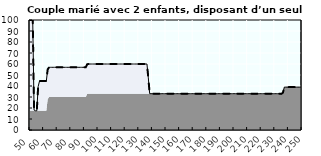
| Category | Coin fiscal marginal (somme des composantes) | Taux d’imposition marginal net |
|---|---|---|
| 50.0 | 100 | 100 |
| 51.0 | 100 | 100 |
| 52.0 | 100 | 100 |
| 53.0 | 18.1 | 18.1 |
| 54.0 | 17.5 | 17.5 |
| 55.0 | 17.5 | 17.5 |
| 56.0 | 39.546 | 39.546 |
| 57.0 | 44.5 | 44.5 |
| 58.0 | 44.5 | 44.5 |
| 59.0 | 44.5 | 44.5 |
| 60.0 | 44.5 | 44.5 |
| 61.0 | 44.5 | 44.5 |
| 62.0 | 44.5 | 44.5 |
| 63.0 | 55.037 | 55.037 |
| 64.0 | 57 | 57 |
| 65.0 | 57 | 57 |
| 66.0 | 57 | 57 |
| 67.0 | 57 | 57 |
| 68.0 | 57 | 57 |
| 69.0 | 57 | 57 |
| 70.0 | 57 | 57 |
| 71.0 | 57 | 57 |
| 72.0 | 57 | 57 |
| 73.0 | 57 | 57 |
| 74.0 | 57 | 57 |
| 75.0 | 57 | 57 |
| 76.0 | 57 | 57 |
| 77.0 | 57 | 57 |
| 78.0 | 57 | 57 |
| 79.0 | 57 | 57 |
| 80.0 | 57 | 57 |
| 81.0 | 57 | 57 |
| 82.0 | 57 | 57 |
| 83.0 | 57 | 57 |
| 84.0 | 57 | 57 |
| 85.0 | 57 | 57 |
| 86.0 | 57 | 57 |
| 87.0 | 57 | 57 |
| 88.0 | 57 | 57 |
| 89.0 | 57 | 57 |
| 90.0 | 57 | 57 |
| 91.0 | 57 | 57 |
| 92.0 | 59.688 | 59.688 |
| 93.0 | 60 | 60 |
| 94.0 | 60 | 60 |
| 95.0 | 60 | 60 |
| 96.0 | 60 | 60 |
| 97.0 | 60 | 60 |
| 98.0 | 60 | 60 |
| 99.0 | 60 | 60 |
| 100.0 | 60 | 60 |
| 101.0 | 60 | 60 |
| 102.0 | 60 | 60 |
| 103.0 | 60 | 60 |
| 104.0 | 60 | 60 |
| 105.0 | 60 | 60 |
| 106.0 | 60 | 60 |
| 107.0 | 60 | 60 |
| 108.0 | 60 | 60 |
| 109.0 | 60 | 60 |
| 110.0 | 60 | 60 |
| 111.0 | 60 | 60 |
| 112.0 | 60 | 60 |
| 113.0 | 60 | 60 |
| 114.0 | 60 | 60 |
| 115.0 | 60 | 60 |
| 116.0 | 60 | 60 |
| 117.0 | 60 | 60 |
| 118.0 | 60 | 60 |
| 119.0 | 60 | 60 |
| 120.0 | 60 | 60 |
| 121.0 | 60 | 60 |
| 122.0 | 60 | 60 |
| 123.0 | 60 | 60 |
| 124.0 | 60 | 60 |
| 125.0 | 60 | 60 |
| 126.0 | 60 | 60 |
| 127.0 | 60 | 60 |
| 128.0 | 60 | 60 |
| 129.0 | 60 | 60 |
| 130.0 | 60 | 60 |
| 131.0 | 60 | 60 |
| 132.0 | 60 | 60 |
| 133.0 | 60 | 60 |
| 134.0 | 60 | 60 |
| 135.0 | 60 | 60 |
| 136.0 | 60 | 60 |
| 137.0 | 47.372 | 47.372 |
| 138.0 | 33 | 33 |
| 139.0 | 33 | 33 |
| 140.0 | 33 | 33 |
| 141.0 | 33 | 33 |
| 142.0 | 33 | 33 |
| 143.0 | 33 | 33 |
| 144.0 | 33 | 33 |
| 145.0 | 33 | 33 |
| 146.0 | 33 | 33 |
| 147.0 | 33 | 33 |
| 148.0 | 33 | 33 |
| 149.0 | 33 | 33 |
| 150.0 | 33 | 33 |
| 151.0 | 33 | 33 |
| 152.0 | 33 | 33 |
| 153.0 | 33 | 33 |
| 154.0 | 33 | 33 |
| 155.0 | 33 | 33 |
| 156.0 | 33 | 33 |
| 157.0 | 33 | 33 |
| 158.0 | 33 | 33 |
| 159.0 | 33 | 33 |
| 160.0 | 33 | 33 |
| 161.0 | 33 | 33 |
| 162.0 | 33 | 33 |
| 163.0 | 33 | 33 |
| 164.0 | 33 | 33 |
| 165.0 | 33 | 33 |
| 166.0 | 33 | 33 |
| 167.0 | 33 | 33 |
| 168.0 | 33 | 33 |
| 169.0 | 33 | 33 |
| 170.0 | 33 | 33 |
| 171.0 | 33 | 33 |
| 172.0 | 33 | 33 |
| 173.0 | 33 | 33 |
| 174.0 | 33 | 33 |
| 175.0 | 33 | 33 |
| 176.0 | 33 | 33 |
| 177.0 | 33 | 33 |
| 178.0 | 33 | 33 |
| 179.0 | 33 | 33 |
| 180.0 | 33 | 33 |
| 181.0 | 33 | 33 |
| 182.0 | 33 | 33 |
| 183.0 | 33 | 33 |
| 184.0 | 33 | 33 |
| 185.0 | 33 | 33 |
| 186.0 | 33 | 33 |
| 187.0 | 33 | 33 |
| 188.0 | 33 | 33 |
| 189.0 | 33 | 33 |
| 190.0 | 33 | 33 |
| 191.0 | 33 | 33 |
| 192.0 | 33 | 33 |
| 193.0 | 33 | 33 |
| 194.0 | 33 | 33 |
| 195.0 | 33 | 33 |
| 196.0 | 33 | 33 |
| 197.0 | 33 | 33 |
| 198.0 | 33 | 33 |
| 199.0 | 33 | 33 |
| 200.0 | 33 | 33 |
| 201.0 | 33 | 33 |
| 202.0 | 33 | 33 |
| 203.0 | 33 | 33 |
| 204.0 | 33 | 33 |
| 205.0 | 33 | 33 |
| 206.0 | 33 | 33 |
| 207.0 | 33 | 33 |
| 208.0 | 33 | 33 |
| 209.0 | 33 | 33 |
| 210.0 | 33 | 33 |
| 211.0 | 33 | 33 |
| 212.0 | 33 | 33 |
| 213.0 | 33 | 33 |
| 214.0 | 33 | 33 |
| 215.0 | 33 | 33 |
| 216.0 | 33 | 33 |
| 217.0 | 33 | 33 |
| 218.0 | 33 | 33 |
| 219.0 | 33 | 33 |
| 220.0 | 33 | 33 |
| 221.0 | 33 | 33 |
| 222.0 | 33 | 33 |
| 223.0 | 33 | 33 |
| 224.0 | 33 | 33 |
| 225.0 | 33 | 33 |
| 226.0 | 33 | 33 |
| 227.0 | 33 | 33 |
| 228.0 | 33 | 33 |
| 229.0 | 33 | 33 |
| 230.0 | 33 | 33 |
| 231.0 | 33 | 33 |
| 232.0 | 33 | 33 |
| 233.0 | 33 | 33 |
| 234.0 | 33 | 33 |
| 235.0 | 33 | 33 |
| 236.0 | 33.966 | 33.966 |
| 237.0 | 39 | 39 |
| 238.0 | 39 | 39 |
| 239.0 | 39 | 39 |
| 240.0 | 39 | 39 |
| 241.0 | 39 | 39 |
| 242.0 | 39 | 39 |
| 243.0 | 39 | 39 |
| 244.0 | 39 | 39 |
| 245.0 | 39 | 39 |
| 246.0 | 39 | 39 |
| 247.0 | 39 | 39 |
| 248.0 | 39 | 39 |
| 249.0 | 39 | 39 |
| 250.0 | 39 | 39 |